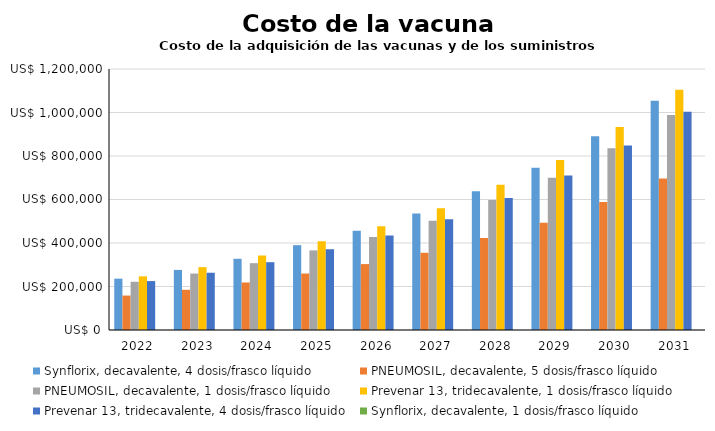
| Category | Synflorix, decavalente, 4 dosis/frasco líquido | PNEUMOSIL, decavalente, 5 dosis/frasco líquido | PNEUMOSIL, decavalente, 1 dosis/frasco líquido | Prevenar 13, tridecavalente, 1 dosis/frasco líquido | Prevenar 13, tridecavalente, 4 dosis/frasco líquido | Synflorix, decavalente, 1 dosis/frasco líquido |
|---|---|---|---|---|---|---|
| 2022.0 | 236020.522 | 158353.391 | 221732.884 | 246804.379 | 224925.217 | 0 |
| 2023.0 | 276297.231 | 184871.923 | 259478.641 | 288991.372 | 263236.473 | 0 |
| 2024.0 | 327326.119 | 218444.292 | 307296.229 | 342444.047 | 311771.572 | 0 |
| 2025.0 | 389972.507 | 259638.016 | 365996.187 | 408069.075 | 371353.294 | 0 |
| 2026.0 | 456083.084 | 303106.765 | 427941.576 | 477323.405 | 434229.324 | 0 |
| 2027.0 | 535149.945 | 355074.963 | 502023.369 | 560152.837 | 509424.948 | 0 |
| 2028.0 | 637792.028 | 422505.957 | 598188.024 | 667683.879 | 607036.875 | 0 |
| 2029.0 | 746111.001 | 493663.242 | 699670.737 | 781162.645 | 710047.036 | 0 |
| 2030.0 | 890975.356 | 588788.565 | 835385.105 | 932933.121 | 847805.815 | 0 |
| 2031.0 | 1054373.028 | 696070.852 | 988459.795 | 1104122.252 | 1003187.002 | 0 |